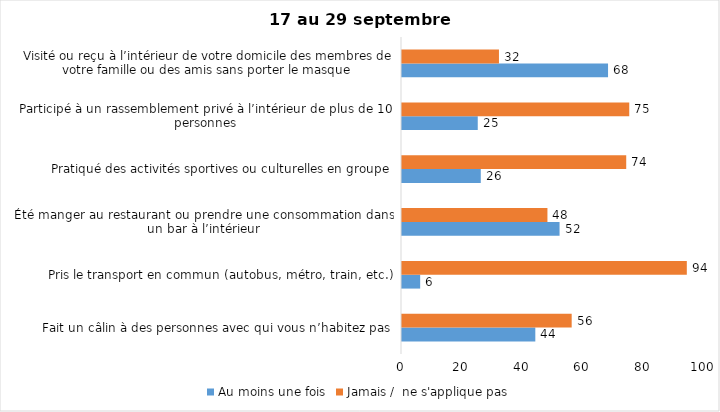
| Category | Au moins une fois | Jamais /  ne s'applique pas |
|---|---|---|
| Fait un câlin à des personnes avec qui vous n’habitez pas | 44 | 56 |
| Pris le transport en commun (autobus, métro, train, etc.) | 6 | 94 |
| Été manger au restaurant ou prendre une consommation dans un bar à l’intérieur | 52 | 48 |
| Pratiqué des activités sportives ou culturelles en groupe | 26 | 74 |
| Participé à un rassemblement privé à l’intérieur de plus de 10 personnes | 25 | 75 |
| Visité ou reçu à l’intérieur de votre domicile des membres de votre famille ou des amis sans porter le masque | 68 | 32 |